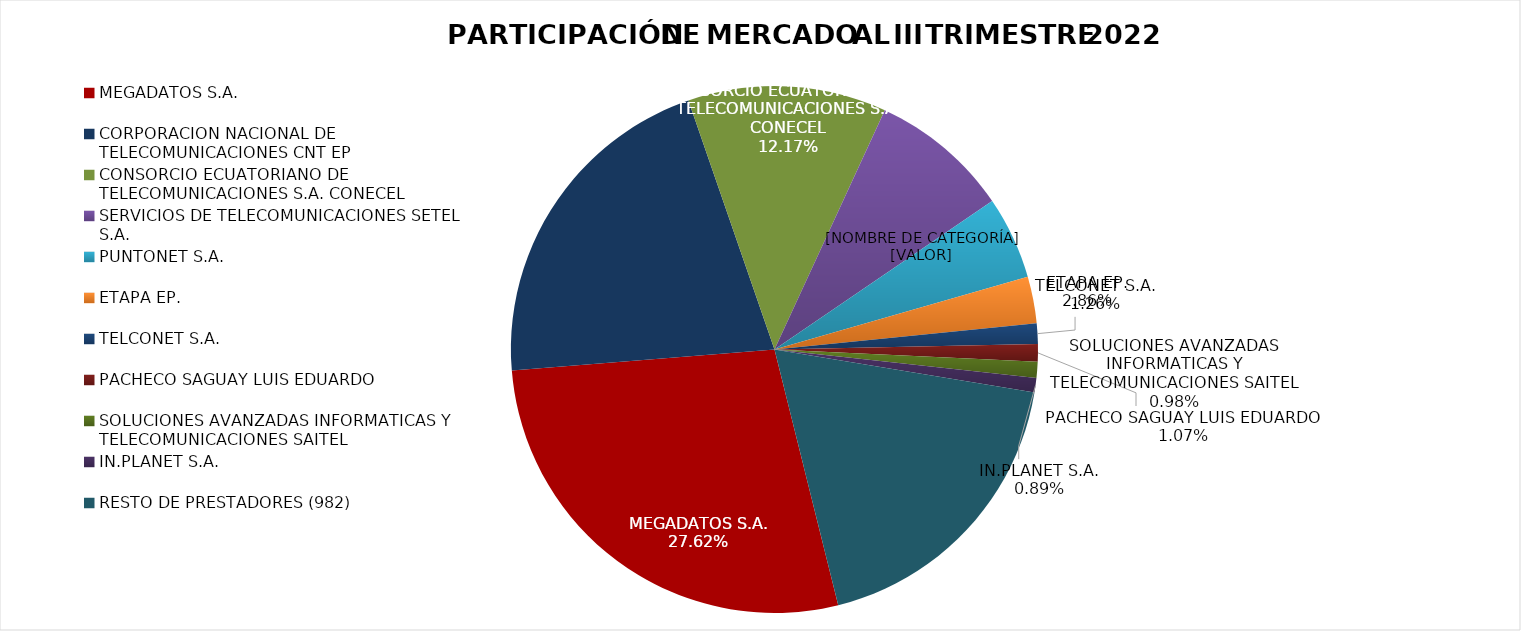
| Category | Series 0 |
|---|---|
| MEGADATOS S.A. | 0.276 |
| CORPORACION NACIONAL DE TELECOMUNICACIONES CNT EP | 0.21 |
| CONSORCIO ECUATORIANO DE TELECOMUNICACIONES S.A. CONECEL | 0.122 |
| SERVICIOS DE TELECOMUNICACIONES SETEL S.A. | 0.086 |
| PUNTONET S.A. | 0.051 |
| ETAPA EP. | 0.029 |
| TELCONET S.A. | 0.013 |
| PACHECO SAGUAY LUIS EDUARDO | 0.011 |
| SOLUCIONES AVANZADAS INFORMATICAS Y TELECOMUNICACIONES SAITEL | 0.01 |
| IN.PLANET S.A. | 0.009 |
| RESTO DE PRESTADORES (982)  | 0.185 |